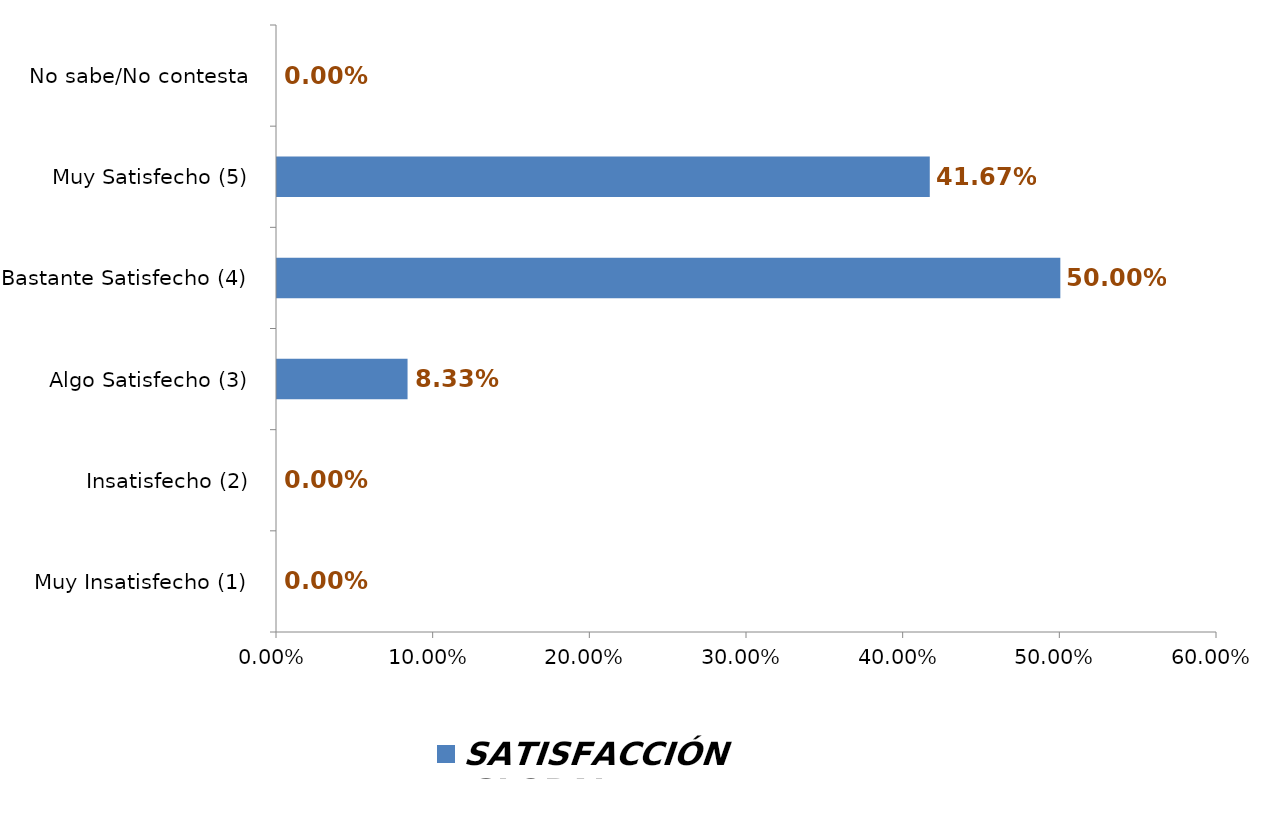
| Category | SATISFACCIÓN GLOBAL |
|---|---|
| Muy Insatisfecho (1) | 0 |
| Insatisfecho (2) | 0 |
| Algo Satisfecho (3) | 0.083 |
| Bastante Satisfecho (4) | 0.5 |
| Muy Satisfecho (5) | 0.417 |
| No sabe/No contesta | 0 |